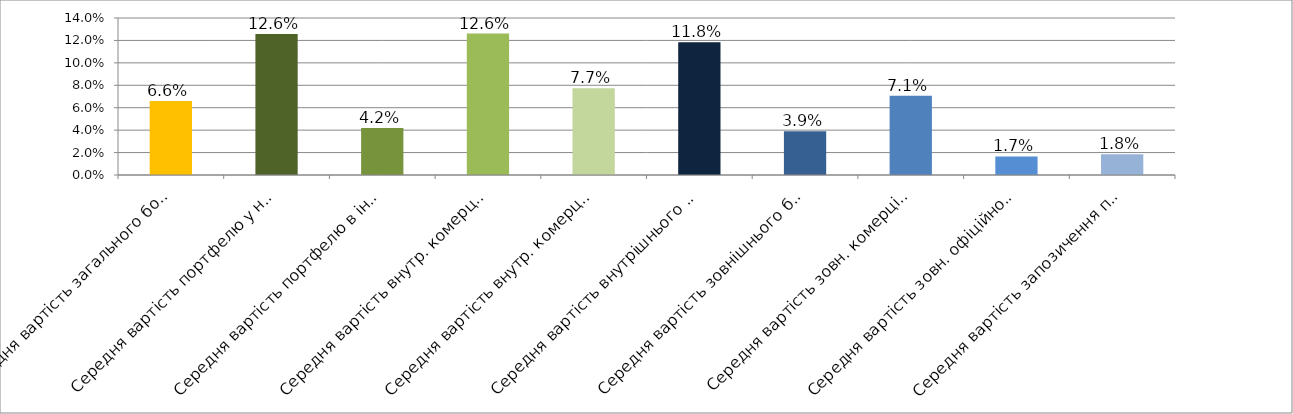
| Category | Series 0 |
|---|---|
| Середня вартість загального боргового портфелю | 0.066 |
| Середня вартість портфелю у нац.валюті | 0.126 |
| Середня вартість портфелю в іноземній валюті | 0.042 |
| Середня вартість внутр. комерційного портфелю в нац.валюті | 0.126 |
| Середня вартість внутр. комерційного портфелю в іноземній валюті | 0.077 |
| Середня вартість внутрішнього боргового портфелю | 0.118 |
| Середня вартість зовнішнього боргового портфелю | 0.039 |
| Середня вартість зовн. комерційного портфелю в іноземній валюті | 0.071 |
| Середня вартість зовн. офіційного портфелю в іноземній валюті | 0.017 |
| Середня вартість запозичення під держгарантії США в іноземній валюті | 0.018 |